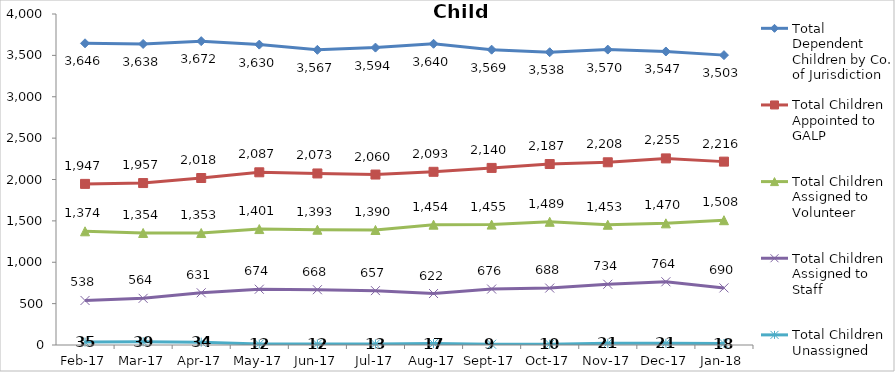
| Category | Total Dependent Children by Co. of Jurisdiction | Total Children Appointed to GALP | Total Children Assigned to Volunteer | Total Children Assigned to Staff | Total Children Unassigned |
|---|---|---|---|---|---|
| 2017-02-01 | 3646 | 1947 | 1374 | 538 | 35 |
| 2017-03-01 | 3638 | 1957 | 1354 | 564 | 39 |
| 2017-04-01 | 3672 | 2018 | 1353 | 631 | 34 |
| 2017-05-01 | 3630 | 2087 | 1401 | 674 | 12 |
| 2017-06-01 | 3567 | 2073 | 1393 | 668 | 12 |
| 2017-07-01 | 3594 | 2060 | 1390 | 657 | 13 |
| 2017-08-01 | 3640 | 2093 | 1454 | 622 | 17 |
| 2017-09-01 | 3569 | 2140 | 1455 | 676 | 9 |
| 2017-10-01 | 3538 | 2187 | 1489 | 688 | 10 |
| 2017-11-01 | 3570 | 2208 | 1453 | 734 | 21 |
| 2017-12-01 | 3547 | 2255 | 1470 | 764 | 21 |
| 2018-01-01 | 3503 | 2216 | 1508 | 690 | 18 |